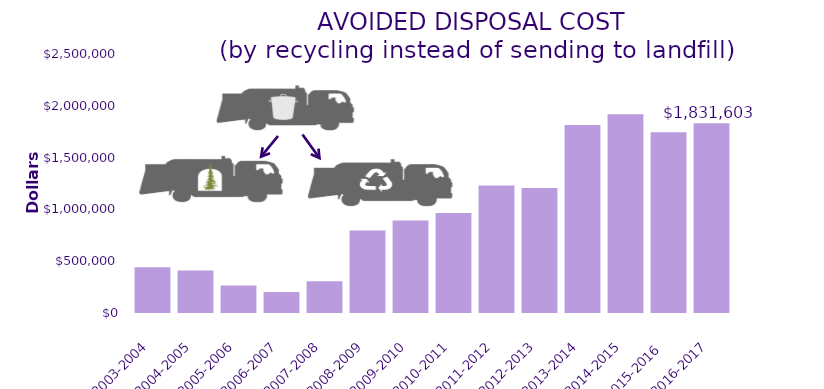
| Category | Series 0 |
|---|---|
| 2003-2004 | 441448 |
| 2004-2005 | 409423 |
| 2005-2006 | 264439 |
| 2006-2007 | 202229 |
| 2007-2008 | 305480 |
| 2008-2009 | 795984 |
| 2009-2010 | 892007 |
| 2010-2011 | 966033 |
| 2011-2012 | 1229504.93 |
| 2012-2013 | 1205941 |
| 2013-2014 | 1814648 |
| 2014-2015 | 1918584 |
| 2015-2016  | 1744309 |
| 2016-2017 | 1831603 |